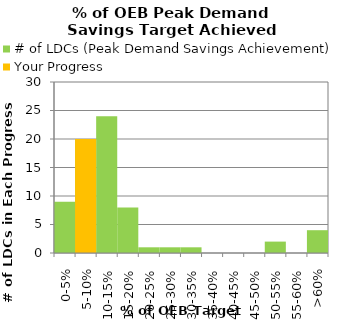
| Category | # of LDCs (Peak Demand Savings Achievement) | Your Progress |
|---|---|---|
| 0-5% | 9 | 0 |
| 5-10% | 20 | 20 |
| 10-15% | 24 | 0 |
| 15-20% | 8 | 0 |
| 20-25% | 1 | 0 |
| 25-30% | 1 | 0 |
| 30-35% | 1 | 0 |
| 35-40% | 0 | 0 |
| 40-45% | 0 | 0 |
| 45-50% | 0 | 0 |
| 50-55% | 2 | 0 |
| 55-60% | 0 | 0 |
| >60% | 4 | 0 |